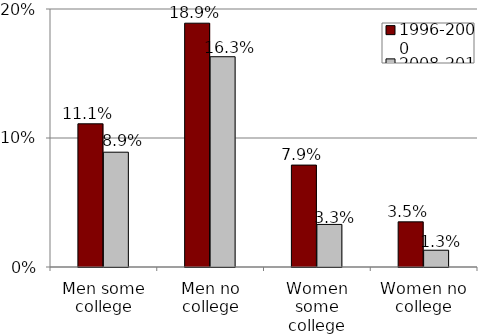
| Category | 1996-2000 | 2008-2012 |
|---|---|---|
| Men some college | 0.111 | 0.089 |
| Men no college | 0.189 | 0.163 |
| Women some college | 0.079 | 0.033 |
| Women no college | 0.035 | 0.013 |